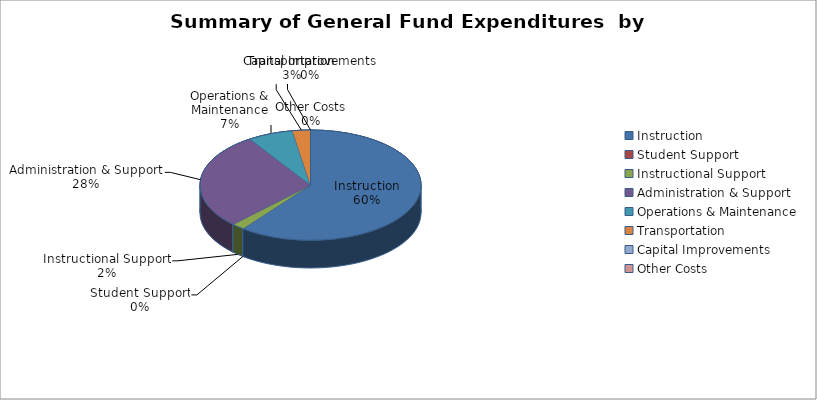
| Category | 2018-2019 |
|---|---|
| Instruction | 1026290 |
| Student Support | 0 |
| Instructional Support | 32270 |
| Administration & Support | 481559 |
| Operations & Maintenance | 112400 |
| Transportation | 44405 |
| Capital Improvements | 0 |
| Other Costs | 0 |